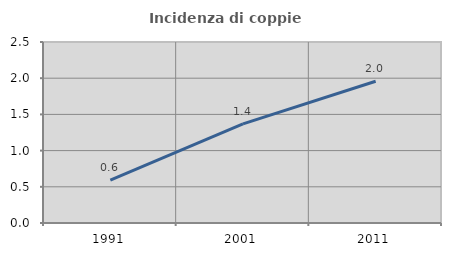
| Category | Incidenza di coppie miste |
|---|---|
| 1991.0 | 0.591 |
| 2001.0 | 1.369 |
| 2011.0 | 1.958 |